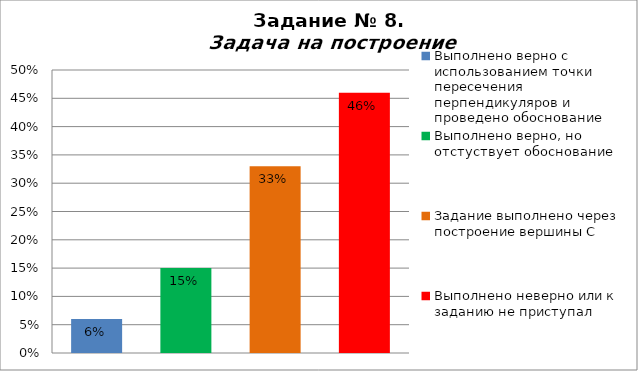
| Category | Задача на построение |
|---|---|
| Выполнено верно с использованием точки пересечения перпендикуляров и проведено обоснование | 0.06 |
| Выполнено верно, но отстуствует обоснование | 0.15 |
| Задание выполнено через построение вершины С | 0.33 |
| Выполнено неверно или к заданию не приступал | 0.46 |